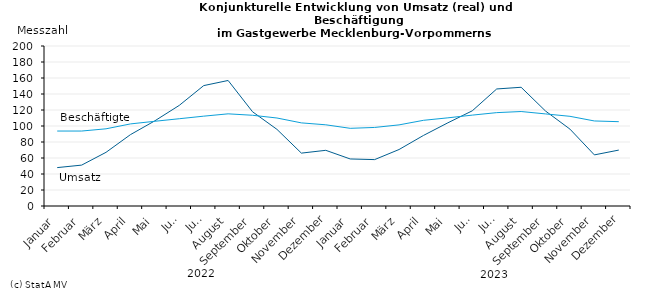
| Category | Umsatz | Beschäftigte |
|---|---|---|
|    Januar | 48 | 93.7 |
|    Februar | 51.1 | 93.7 |
|    März | 67.1 | 96.5 |
|    April | 89.2 | 102.6 |
|    Mai | 106.5 | 105.9 |
|    Juni | 125.8 | 109.1 |
|    Juli | 150.5 | 112.3 |
|    August | 156.9 | 115.2 |
|    September | 117.8 | 113.4 |
|    Oktober | 95.8 | 110 |
|    November | 66.1 | 103.9 |
|    Dezember | 69.6 | 101.5 |
|    Januar | 58.8 | 97.1 |
|    Februar | 58 | 98.2 |
|    März | 70.6 | 101.4 |
|    April | 88.2 | 107.1 |
|    Mai | 104 | 110.2 |
|    Juni | 119 | 113.6 |
|    Juli | 146.3 | 116.7 |
|    August | 148.4 | 118.1 |
|    September | 118.7 | 115.1 |
|    Oktober | 96.1 | 112.1 |
|    November | 63.9 | 106.3 |
|    Dezember | 69.9 | 105.4 |